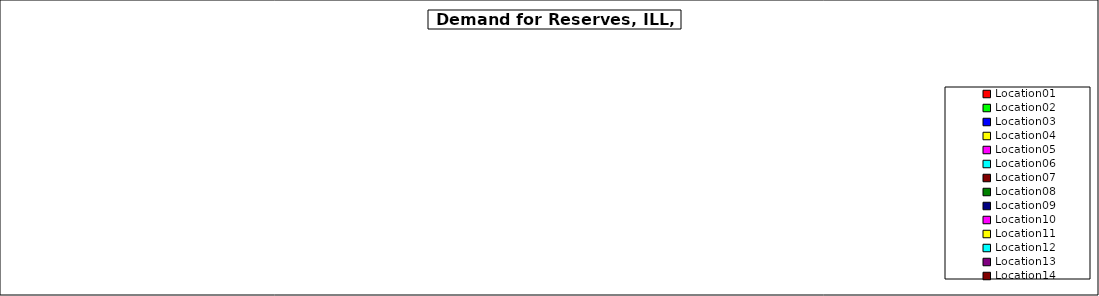
| Category | Series 0 |
|---|---|
| Location01 | 0 |
| Location02 | 0 |
| Location03 | 0 |
| Location04 | 0 |
| Location05 | 0 |
| Location06 | 0 |
| Location07 | 0 |
| Location08 | 0 |
| Location09 | 0 |
| Location10 | 0 |
| Location11 | 0 |
| Location12 | 0 |
| Location13 | 0 |
| Location14 | 0 |